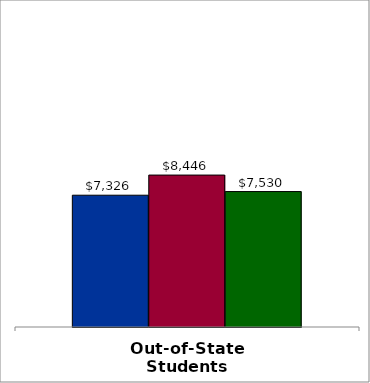
| Category | 50 states and D.C. | SREB states | State |
|---|---|---|---|
| Out-of-State Students | 7326 | 8446 | 7530 |